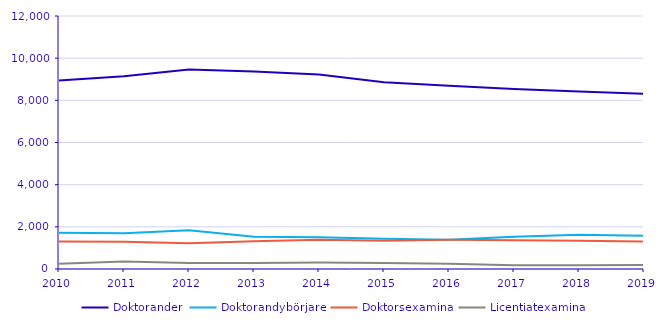
| Category | Doktorander | Doktorandybörjare | Doktorsexamina | Licentiatexamina |
|---|---|---|---|---|
| 2010.0 | 8936 | 1725 | 1309 | 254 |
| 2011.0 | 9142 | 1699 | 1290 | 358 |
| 2012.0 | 9465 | 1832 | 1224 | 286 |
| 2013.0 | 9367 | 1526 | 1318 | 289 |
| 2014.0 | 9225 | 1508 | 1386 | 309 |
| 2015.0 | 8862 | 1429 | 1338 | 286 |
| 2016.0 | 8690 | 1383 | 1387 | 254 |
| 2017.0 | 8540 | 1528 | 1369 | 179 |
| 2018.0 | 8424 | 1625 | 1341 | 182 |
| 2019.0 | 8312 | 1579 | 1306 | 195 |